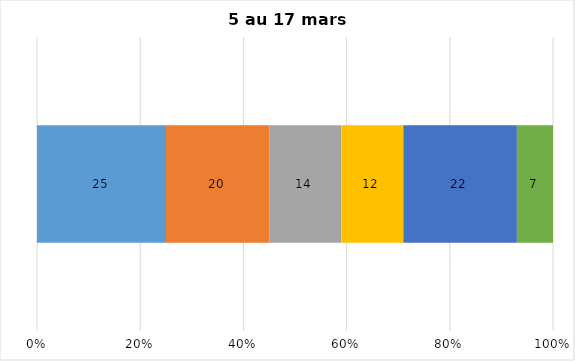
| Category | Plusieurs fois par jour | Une fois par jour | Quelques fois par semaine   | Une fois par semaine ou moins   |  Jamais   |  Je n’utilise pas les médias sociaux |
|---|---|---|---|---|---|---|
| 0 | 25 | 20 | 14 | 12 | 22 | 7 |